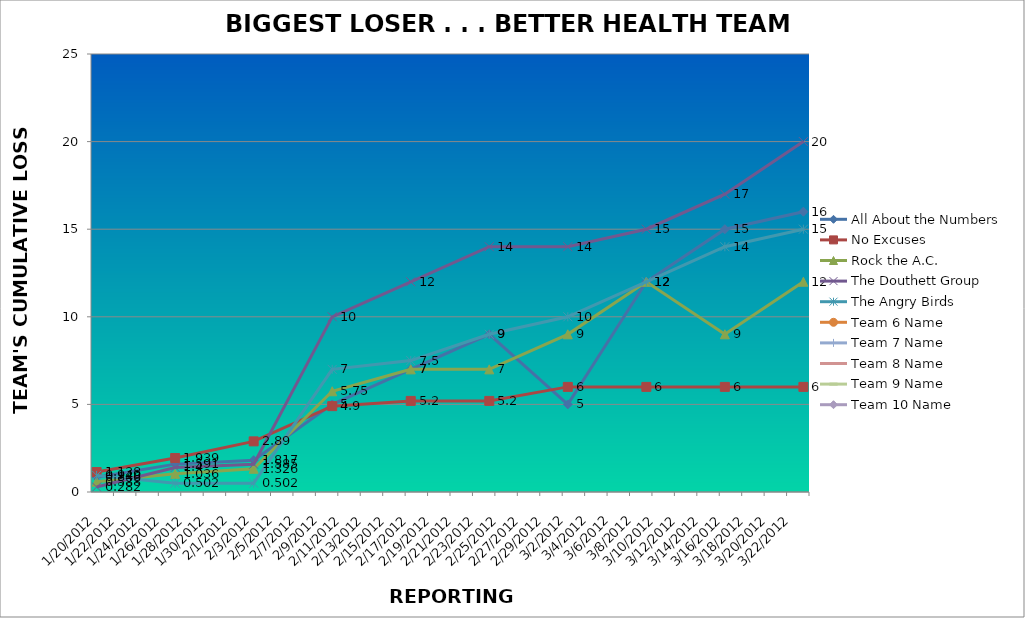
| Category | All About the Numbers  | No Excuses  | Rock the A.C. | The Douthett Group | The Angry Birds | Team 6 Name | Team 7 Name | Team 8 Name | Team 9 Name | Team 10 Name |
|---|---|---|---|---|---|---|---|---|---|---|
| 1/20/12 | 0.846 | 1.138 | 0.588 | 0.282 | 0.949 |  |  |  |  |  |
| 1/27/12 | 1.591 | 1.939 | 1.036 | 1.4 | 0.502 |  |  |  |  |  |
| 2/3/12 | 1.817 | 2.89 | 1.326 | 1.585 | 0.502 |  |  |  |  |  |
| 2/10/12 | 5 | 4.9 | 5.75 | 10 | 7 |  |  |  |  |  |
| 2/17/12 | 7 | 5.2 | 7 | 12 | 7.5 |  |  |  |  |  |
| 2/24/12 | 9 | 5.2 | 7 | 14 | 9 |  |  |  |  |  |
| 3/2/12 | 5 | 6 | 9 | 14 | 10 |  |  |  |  |  |
| 3/9/12 | 12 | 6 | 12 | 15 | 12 |  |  |  |  |  |
| 3/16/12 | 15 | 6 | 9 | 17 | 14 |  |  |  |  |  |
| 3/23/12 | 16 | 6 | 12 | 20 | 15 |  |  |  |  |  |